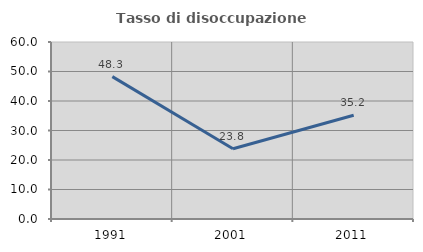
| Category | Tasso di disoccupazione giovanile  |
|---|---|
| 1991.0 | 48.258 |
| 2001.0 | 23.837 |
| 2011.0 | 35.152 |